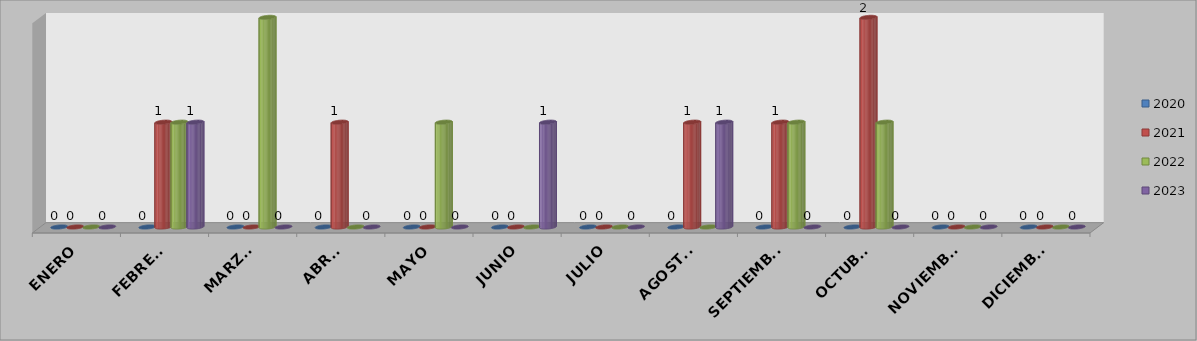
| Category | 2020 | 2021 | 2022 | 2023 |
|---|---|---|---|---|
| ENERO | 0 | 0 | 0 | 0 |
| FEBRERO | 0 | 1 | 1 | 1 |
| MARZO  | 0 | 0 | 2 | 0 |
| ABRIL | 0 | 1 | 0 | 0 |
| MAYO | 0 | 0 | 1 | 0 |
| JUNIO | 0 | 0 | 0 | 1 |
| JULIO | 0 | 0 | 0 | 0 |
| AGOSTO | 0 | 1 | 0 | 1 |
| SEPTIEMBRE | 0 | 1 | 1 | 0 |
| OCTUBRE | 0 | 2 | 1 | 0 |
| NOVIEMBRE | 0 | 0 | 0 | 0 |
| DICIEMBRE | 0 | 0 | 0 | 0 |